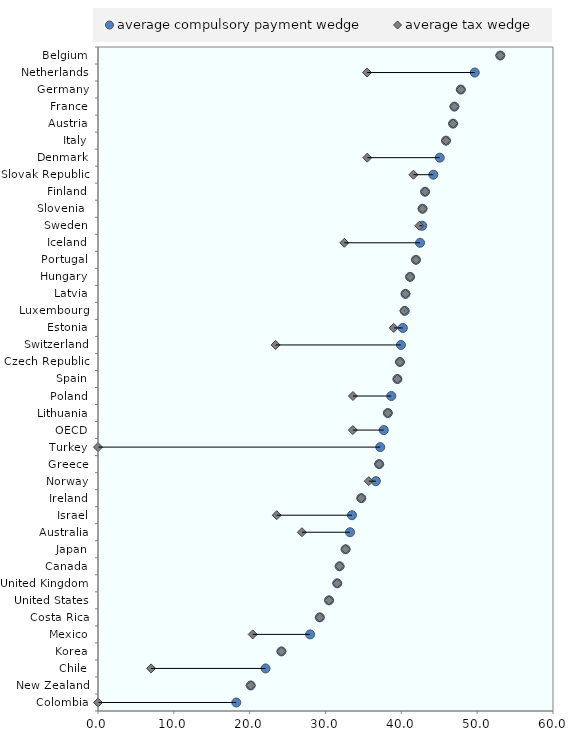
| Category | blankName |
|---|---|
| Colombia | 0 |
| New Zealand | 20.137 |
| Chile | 7 |
| Korea | 24.186 |
| Mexico | 20.402 |
| Costa Rica | 29.249 |
| United States | 30.469 |
| United Kingdom | 31.549 |
| Canada | 31.863 |
| Japan | 32.649 |
| Australia | 26.896 |
| Israel | 23.569 |
| Ireland | 34.72 |
| Norway | 35.707 |
| Greece | 37.076 |
| Turkey | 0 |
| OECD | 33.606 |
| Lithuania | 38.219 |
| Poland | 33.62 |
| Spain | 39.485 |
| Czech Republic | 39.818 |
| Switzerland | 23.419 |
| Estonia | 39.005 |
| Luxembourg | 40.379 |
| Latvia | 40.55 |
| Hungary | 41.15 |
| Portugal | 41.931 |
| Iceland | 32.485 |
| Sweden | 42.372 |
| Slovenia  | 42.797 |
| Finland | 43.134 |
| Slovak Republic | 41.599 |
| Denmark | 35.511 |
| Italy | 45.893 |
| Austria | 46.821 |
| France | 46.998 |
| Germany | 47.848 |
| Netherlands | 35.484 |
| Belgium | 53.048 |